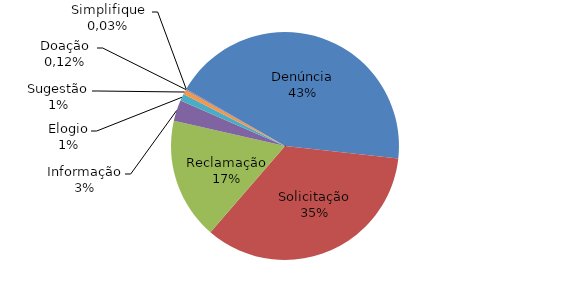
| Category | Series 0 |
|---|---|
| Denúncia | 5244 |
| Solicitação | 4176 |
| Reclamação | 2078 |
| Informação | 360 |
| Elogio | 119 |
| Sugestão | 79 |
| Doação | 15 |
| Simplifique | 4 |